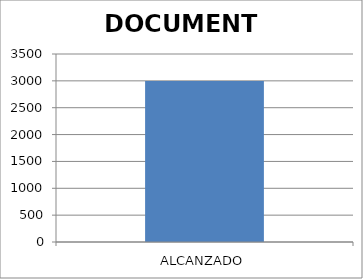
| Category | DOCUMENTO |
|---|---|
| ALCANZADO | 2998 |